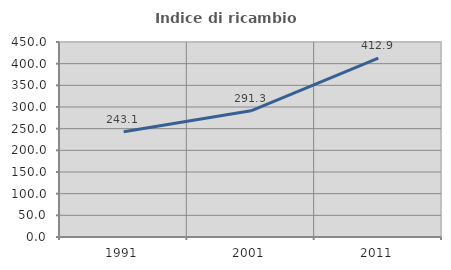
| Category | Indice di ricambio occupazionale  |
|---|---|
| 1991.0 | 243.103 |
| 2001.0 | 291.25 |
| 2011.0 | 412.903 |